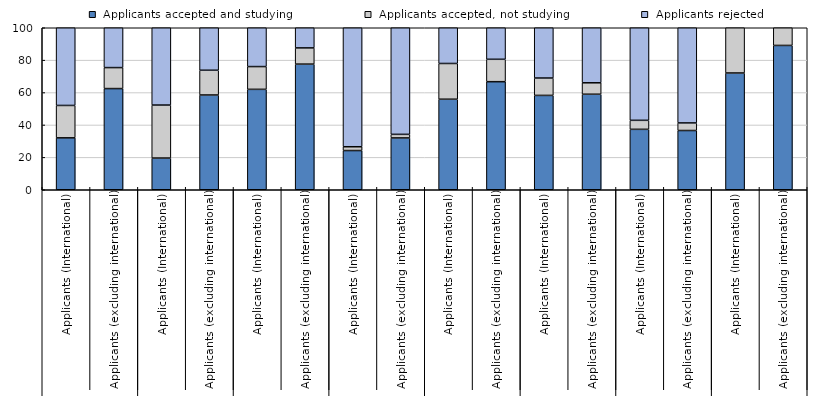
| Category |  Applicants accepted and studying |  Applicants accepted, not studying |  Applicants rejected |
|---|---|---|---|
| 0 | 32.037 | 20 | 47.963 |
| 1 | 62.458 | 12.953 | 24.589 |
| 2 | 19.567 | 32.715 | 47.718 |
| 3 | 58.489 | 15.279 | 26.232 |
| 4 | 61.983 | 14.052 | 23.965 |
| 5 | 77.551 | 10.007 | 12.442 |
| 6 | 24.206 | 2.34 | 73.454 |
| 7 | 31.991 | 2.204 | 65.804 |
| 8 | 55.887 | 22.057 | 22.057 |
| 9 | 66.706 | 13.828 | 19.466 |
| 10 | 58.238 | 10.728 | 31.034 |
| 11 | 58.965 | 7.063 | 33.972 |
| 12 | 37.302 | 5.556 | 57.143 |
| 13 | 36.57 | 4.674 | 58.756 |
| 14 | 72.068 | 27.932 | 0 |
| 15 | 89.09 | 10.91 | 0 |